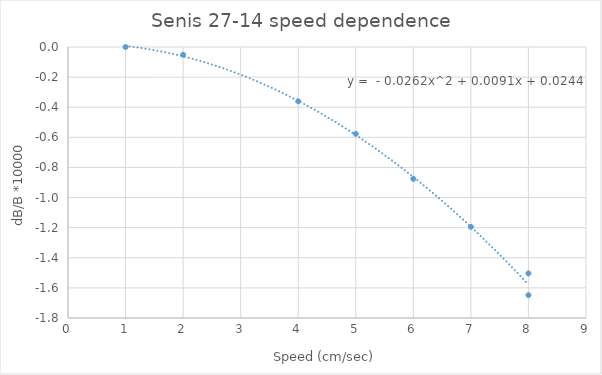
| Category | Series 0 |
|---|---|
| 8.0 | -1.504 |
| 7.0 | -1.195 |
| 6.0 | -0.876 |
| 5.0 | -0.577 |
| 4.0 | -0.361 |
| 2.0 | -0.052 |
| 1.0 | 0 |
| 8.0 | -1.648 |